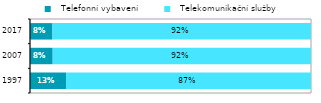
| Category |   Telefonní vybavení  |   Telekomunikační služby |
|---|---|---|
| 1997.0 | 0.128 | 0.872 |
| 2007.0 | 0.081 | 0.919 |
| 2017.0 | 0.08 | 0.92 |